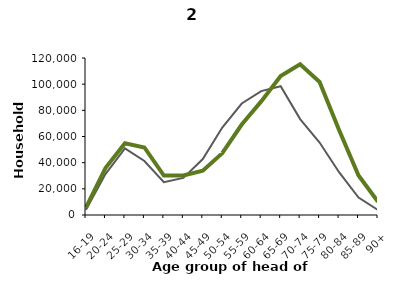
| Category | Series 0 | Series 1 |
|---|---|---|
| 16-19 | 4015 | 5783 |
| 20-24 | 31256 | 35904 |
| 25-29 | 50855 | 54782 |
| 30-34 | 41310 | 51627 |
| 35-39 | 25025 | 30123 |
| 40-44 | 28369 | 30225 |
| 45-49 | 42763 | 33859 |
| 50-54 | 66831 | 47279 |
| 55-59 | 85216 | 69130 |
| 60-64 | 94675 | 86850 |
| 65-69 | 98425 | 106145 |
| 70-74 | 73325 | 115166 |
| 75-79 | 55397 | 101733 |
| 80-84 | 32733 | 65040 |
| 85-89 | 13324 | 30227 |
| 90+ | 3822 | 10127 |